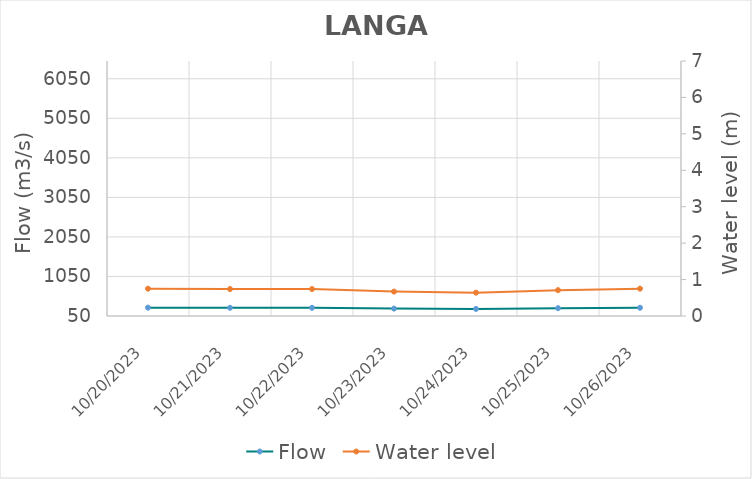
| Category | Flow |
|---|---|
| 7/20/23 | 1855 |
| 7/19/23 | 1830.83 |
| 7/18/23 | 1820 |
| 7/17/23 | 1816.5 |
| 7/16/23 | 1817.78 |
| 7/15/23 | 1815.82 |
| 7/14/23 | 1878.88 |